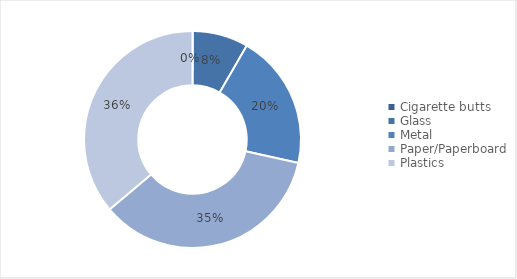
| Category | 2014/15 |
|---|---|
| Cigarette butts | 0.002 |
| Glass | 0.55 |
| Metal | 1.33 |
| Paper/Paperboard | 2.34 |
| Plastics | 2.39 |